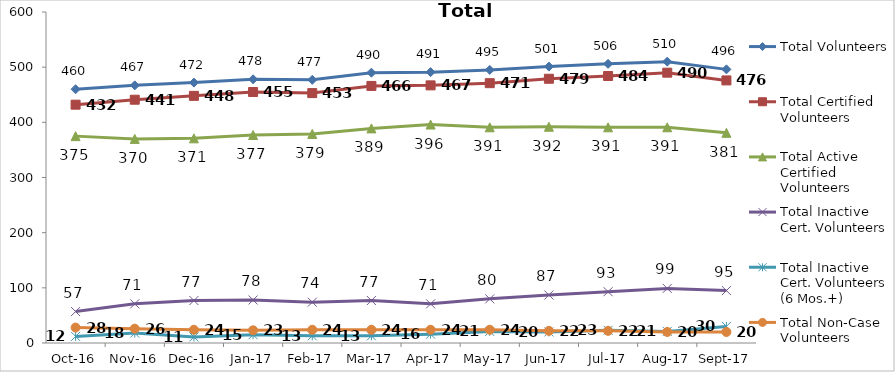
| Category | Total Volunteers | Total Certified Volunteers | Total Active Certified Volunteers | Total Inactive Cert. Volunteers | Total Inactive Cert. Volunteers (6 Mos.+) | Total Non-Case Volunteers |
|---|---|---|---|---|---|---|
| 2016-10-01 | 460 | 432 | 375 | 57 | 12 | 28 |
| 2016-11-01 | 467 | 441 | 370 | 71 | 18 | 26 |
| 2016-12-01 | 472 | 448 | 371 | 77 | 11 | 24 |
| 2017-01-01 | 478 | 455 | 377 | 78 | 15 | 23 |
| 2017-02-01 | 477 | 453 | 379 | 74 | 13 | 24 |
| 2017-03-01 | 490 | 466 | 389 | 77 | 13 | 24 |
| 2017-04-01 | 491 | 467 | 396 | 71 | 16 | 24 |
| 2017-05-01 | 495 | 471 | 391 | 80 | 21 | 24 |
| 2017-06-01 | 501 | 479 | 392 | 87 | 20 | 22 |
| 2017-07-01 | 506 | 484 | 391 | 93 | 23 | 22 |
| 2017-08-01 | 510 | 490 | 391 | 99 | 21 | 20 |
| 2017-09-01 | 496 | 476 | 381 | 95 | 30 | 20 |